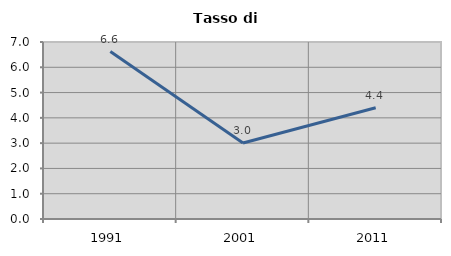
| Category | Tasso di disoccupazione   |
|---|---|
| 1991.0 | 6.621 |
| 2001.0 | 3.008 |
| 2011.0 | 4.402 |